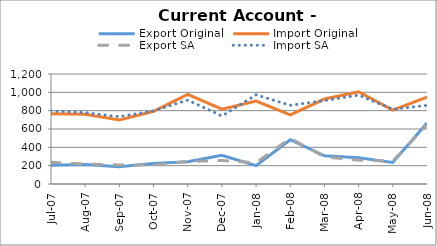
| Category | Export Original | Import Original | Export SA | Import SA |
|---|---|---|---|---|
| 2007-07-31 | 205 | 766 | 237 | 797 |
| 2007-08-31 | 213 | 761 | 217 | 779 |
| 2007-09-30 | 187 | 698 | 208 | 734 |
| 2007-10-31 | 225 | 792 | 207 | 798 |
| 2007-11-30 | 242 | 977 | 246 | 916 |
| 2007-12-31 | 313 | 817 | 256 | 742 |
| 2008-01-31 | 200 | 905 | 232 | 973 |
| 2008-02-29 | 483 | 754 | 498 | 858 |
| 2008-03-31 | 308 | 927 | 296 | 910 |
| 2008-04-30 | 286 | 1006 | 260 | 970 |
| 2008-05-31 | 236 | 806 | 251 | 815 |
| 2008-06-30 | 666 | 948 | 643 | 858 |